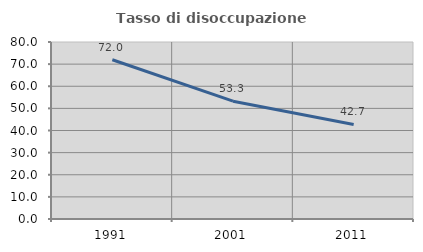
| Category | Tasso di disoccupazione giovanile  |
|---|---|
| 1991.0 | 71.964 |
| 2001.0 | 53.258 |
| 2011.0 | 42.742 |